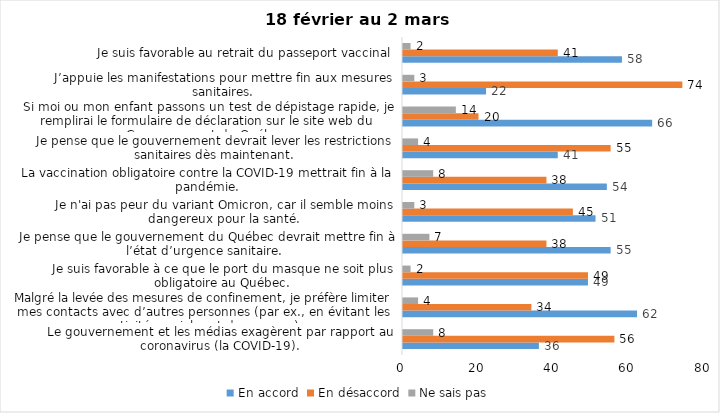
| Category | En accord | En désaccord | Ne sais pas |
|---|---|---|---|
| Le gouvernement et les médias exagèrent par rapport au coronavirus (la COVID-19). | 36 | 56 | 8 |
| Malgré la levée des mesures de confinement, je préfère limiter mes contacts avec d’autres personnes (par ex., en évitant les activités sociales et de groupes) | 62 | 34 | 4 |
| Je suis favorable à ce que le port du masque ne soit plus obligatoire au Québec. | 49 | 49 | 2 |
| Je pense que le gouvernement du Québec devrait mettre fin à l’état d’urgence sanitaire.  | 55 | 38 | 7 |
| Je n'ai pas peur du variant Omicron, car il semble moins dangereux pour la santé. | 51 | 45 | 3 |
| La vaccination obligatoire contre la COVID-19 mettrait fin à la pandémie. | 54 | 38 | 8 |
| Je pense que le gouvernement devrait lever les restrictions sanitaires dès maintenant. | 41 | 55 | 4 |
| Si moi ou mon enfant passons un test de dépistage rapide, je remplirai le formulaire de déclaration sur le site web du Gouvernement du Québec. | 66 | 20 | 14 |
| J’appuie les manifestations pour mettre fin aux mesures sanitaires. | 22 | 74 | 3 |
| Je suis favorable au retrait du passeport vaccinal | 58 | 41 | 2 |